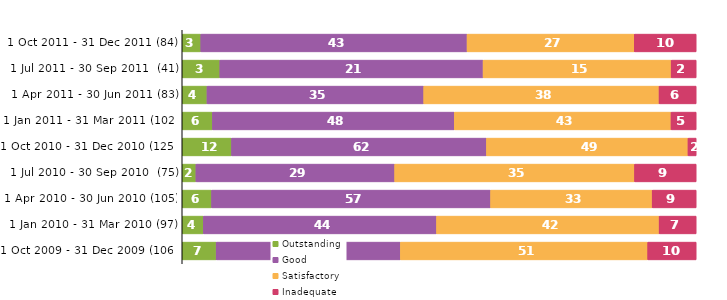
| Category | Outstanding | Good | Satisfactory | Inadequate |
|---|---|---|---|---|
| 1 Oct 2011 - 31 Dec 2011 (84) | 3 | 43 | 27 | 10 |
| 1 Jul 2011 - 30 Sep 2011  (41) | 3 | 21 | 15 | 2 |
| 1 Apr 2011 - 30 Jun 2011 (83) | 4 | 35 | 38 | 6 |
| 1 Jan 2011 - 31 Mar 2011 (102) | 6 | 48 | 43 | 5 |
| 1 Oct 2010 - 31 Dec 2010 (125) | 12 | 62 | 49 | 2 |
| 1 Jul 2010 - 30 Sep 2010  (75) | 2 | 29 | 35 | 9 |
| 1 Apr 2010 - 30 Jun 2010 (105) | 6 | 57 | 33 | 9 |
| 1 Jan 2010 - 31 Mar 2010 (97) | 4 | 44 | 42 | 7 |
| 1 Oct 2009 - 31 Dec 2009 (106) | 7 | 38 | 51 | 10 |